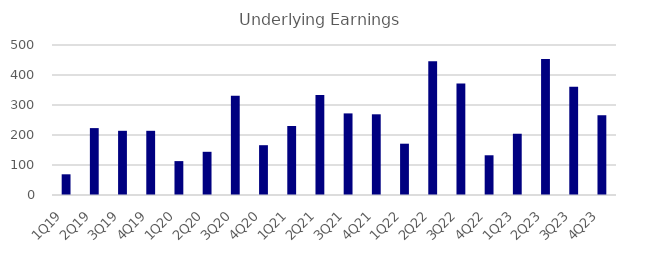
| Category | Underlying Earnings |
|---|---|
| 1Q19 | 69 |
| 2Q19 | 223 |
| 3Q19 | 214 |
| 4Q19 | 214 |
| 1Q20 | 113 |
| 2Q20 | 144 |
| 3Q20 | 331 |
| 4Q20 | 166 |
| 1Q21 | 230 |
| 2Q21 | 333 |
| 3Q21 | 272 |
| 4Q21 | 269 |
| 1Q22 | 171 |
| 2Q22 | 446 |
| 3Q22 | 371.76 |
| 4Q22 | 132.416 |
| 1Q23 | 204.175 |
| 2Q23 | 453.349 |
| 3Q23 | 361.059 |
| 4Q23 | 265.865 |